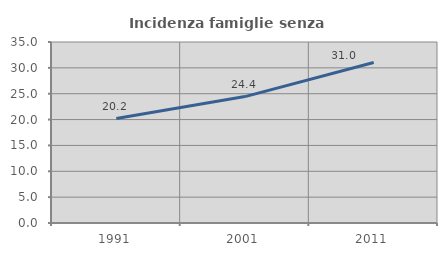
| Category | Incidenza famiglie senza nuclei |
|---|---|
| 1991.0 | 20.192 |
| 2001.0 | 24.444 |
| 2011.0 | 31.045 |